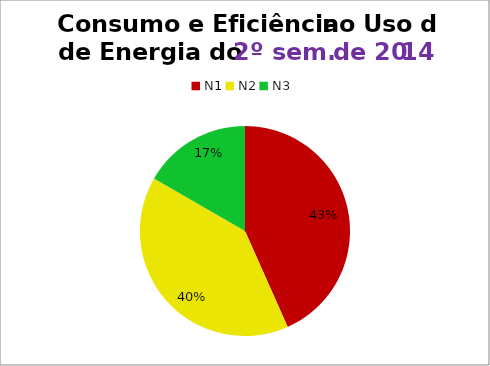
| Category | 2º/14 |
|---|---|
| N1 | 13 |
| N2 | 12 |
| N3 | 5 |